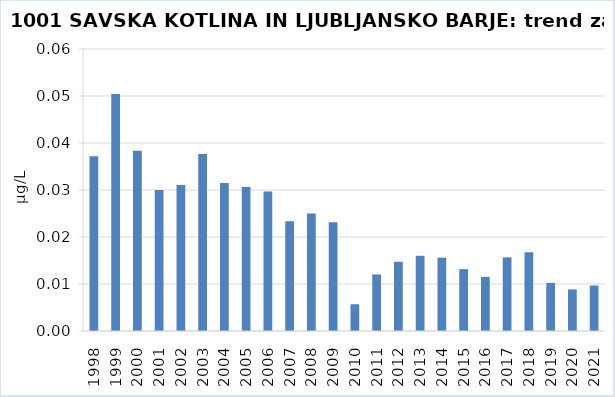
| Category | Vsota |
|---|---|
| 1998 | 0.037 |
| 1999 | 0.05 |
| 2000 | 0.038 |
| 2001 | 0.03 |
| 2002 | 0.031 |
| 2003 | 0.038 |
| 2004 | 0.032 |
| 2005 | 0.031 |
| 2006 | 0.03 |
| 2007 | 0.023 |
| 2008 | 0.025 |
| 2009 | 0.023 |
| 2010 | 0.006 |
| 2011 | 0.012 |
| 2012 | 0.015 |
| 2013 | 0.016 |
| 2014 | 0.016 |
| 2015 | 0.013 |
| 2016 | 0.012 |
| 2017 | 0.016 |
| 2018 | 0.017 |
| 2019 | 0.01 |
| 2020 | 0.009 |
| 2021 | 0.01 |